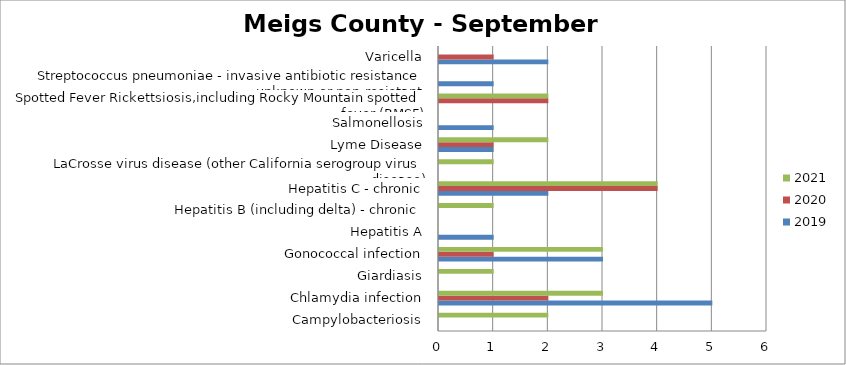
| Category | 2019 | 2020 | 2021 |
|---|---|---|---|
| Campylobacteriosis | 0 | 0 | 2 |
| Chlamydia infection | 5 | 2 | 3 |
| Giardiasis | 0 | 0 | 1 |
| Gonococcal infection | 3 | 1 | 3 |
| Hepatitis A | 1 | 0 | 0 |
| Hepatitis B (including delta) - chronic | 0 | 0 | 1 |
| Hepatitis C - chronic | 2 | 4 | 4 |
| LaCrosse virus disease (other California serogroup virus disease) | 0 | 0 | 1 |
| Lyme Disease | 1 | 1 | 2 |
| Salmonellosis | 1 | 0 | 0 |
| Spotted Fever Rickettsiosis,including Rocky Mountain spotted fever (RMSF) | 0 | 2 | 2 |
| Streptococcus pneumoniae - invasive antibiotic resistance unknown or non-resistant | 1 | 0 | 0 |
| Varicella | 2 | 1 | 0 |